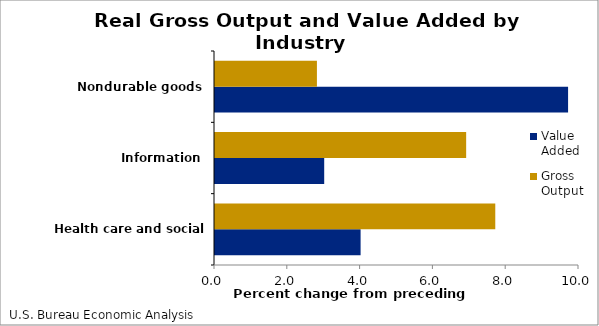
| Category | Value Added | Gross Output |
|---|---|---|
| Health care and social assistance | 4 | 7.7 |
| Information | 3 | 6.9 |
| Nondurable goods | 9.7 | 2.8 |